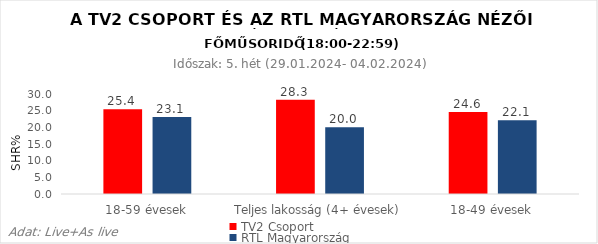
| Category | TV2 Csoport | RTL Magyarország |
|---|---|---|
| 18-59 évesek | 25.4 | 23.1 |
| Teljes lakosság (4+ évesek) | 28.3 | 20 |
| 18-49 évesek | 24.6 | 22.1 |